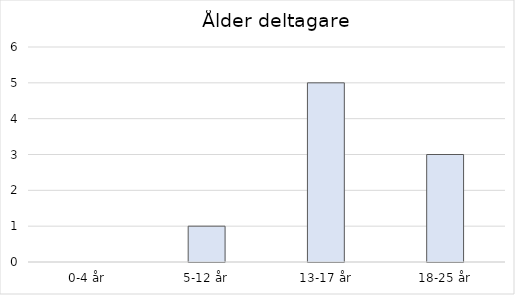
| Category | Series 0 |
|---|---|
| 0-4 år | 0 |
| 5-12 år | 1 |
| 13-17 år | 5 |
| 18-25 år | 3 |